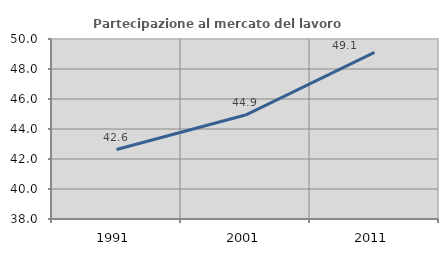
| Category | Partecipazione al mercato del lavoro  femminile |
|---|---|
| 1991.0 | 42.631 |
| 2001.0 | 44.929 |
| 2011.0 | 49.113 |